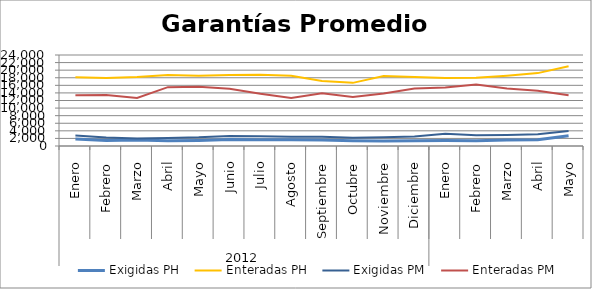
| Category | Exigidas PH | Enteradas PH | Exigidas PM | Enteradas PM |
|---|---|---|---|---|
| 0 | 1828.564 | 18155.583 | 2744.93 | 13413.991 |
| 1 | 1451.155 | 17917.734 | 2215.902 | 13440.832 |
| 2 | 1587.31 | 18166.129 | 1968.766 | 12673.714 |
| 3 | 1353.003 | 18741.256 | 2118.782 | 15515.723 |
| 4 | 1464.668 | 18540.927 | 2278.002 | 15625.393 |
| 5 | 1719.43 | 18734.539 | 2626.915 | 15127.903 |
| 6 | 1674.023 | 18761.463 | 2556.575 | 13766.49 |
| 7 | 1647.243 | 18544.546 | 2463.76 | 12637.427 |
| 8 | 1556.152 | 17124.972 | 2459.803 | 13929.715 |
| 9 | 1402.926 | 16653.067 | 2169.047 | 12937.81 |
| 10 | 1329.011 | 18467.462 | 2322.009 | 13825.53 |
| 11 | 1379.519 | 18204.98 | 2522.413 | 15188.776 |
| 12 | 1462.675 | 17957.148 | 3246.817 | 15415.235 |
| 13 | 1398.609 | 17993.637 | 2845.352 | 16230.589 |
| 14 | 1589.589 | 18548.479 | 2894.834 | 15192.36 |
| 15 | 1623.519 | 19220.98 | 3086.854 | 14555.102 |
| 16 | 2700.009 | 21053.59 | 3968.296 | 13386.678 |